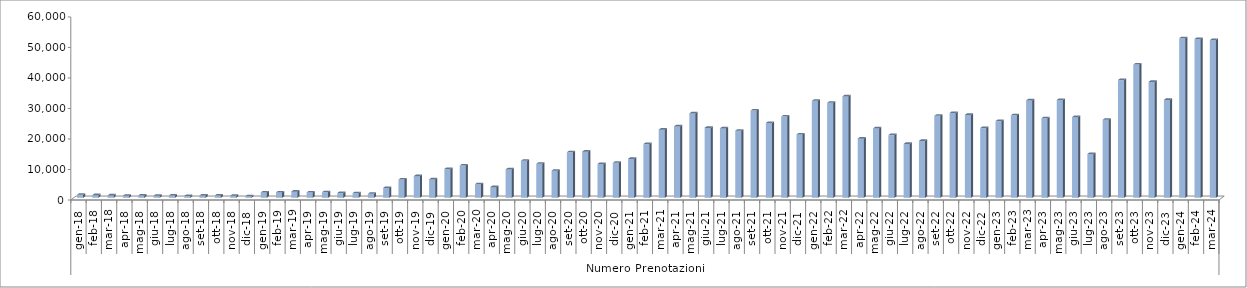
| Category | Series 0 |
|---|---|
| 0 | 996 |
| 1900-01-01 | 849 |
| 1900-01-02 | 765 |
| 1900-01-03 | 668 |
| 1900-01-04 | 737 |
| 1900-01-05 | 673 |
| 1900-01-06 | 732 |
| 1900-01-07 | 570 |
| 1900-01-08 | 752 |
| 1900-01-09 | 752 |
| 1900-01-10 | 648 |
| 1900-01-11 | 466 |
| 1900-01-12 | 1741 |
| 1900-01-13 | 1745 |
| 1900-01-14 | 2021 |
| 1900-01-15 | 1730 |
| 1900-01-16 | 1790 |
| 1900-01-17 | 1559 |
| 1900-01-18 | 1484 |
| 1900-01-19 | 1293 |
| 1900-01-20 | 3217 |
| 1900-01-21 | 5987 |
| 1900-01-22 | 7090 |
| 1900-01-23 | 6030 |
| 1900-01-24 | 9451 |
| 1900-01-25 | 10561 |
| 1900-01-26 | 4442 |
| 1900-01-27 | 3496 |
| 1900-01-28 | 9296 |
| 1900-01-29 | 12120 |
| 1900-01-30 | 11135 |
| 1900-01-31 | 8877 |
| 1900-02-01 | 14903 |
| 1900-02-02 | 15123 |
| 1900-02-03 | 11075 |
| 1900-02-04 | 11456 |
| 1900-02-05 | 12756 |
| 1900-02-06 | 17612 |
| 1900-02-07 | 22323 |
| 1900-02-08 | 23401 |
| 1900-02-09 | 27652 |
| 1900-02-10 | 22918 |
| 1900-02-11 | 22750 |
| 1900-02-12 | 21988 |
| 1900-02-13 | 28587 |
| 1900-02-14 | 24526 |
| 1900-02-15 | 26608 |
| 1900-02-16 | 20755 |
| 1900-02-17 | 31777 |
| 1900-02-18 | 31128 |
| 1900-02-19 | 33234 |
| 1900-02-20 | 19395 |
| 1900-02-21 | 22731 |
| 1900-02-22 | 20543 |
| 1900-02-23 | 17657 |
| 1900-02-24 | 18639 |
| 1900-02-25 | 26870 |
| 1900-02-26 | 27796 |
| 1900-02-27 | 27163 |
| 1900-02-28 | 22847 |
| 1900-02-28 | 25133 |
| 1900-03-01 | 27034 |
| 1900-03-02 | 31908 |
| 1900-03-03 | 26073 |
| 1900-03-04 | 32052 |
| 1900-03-05 | 26434 |
| 1900-03-06 | 14356 |
| 1900-03-07 | 25574 |
| 1900-03-08 | 38589 |
| 1900-03-09 | 43658 |
| 1900-03-10 | 37985 |
| 1900-03-11 | 32076 |
| 1900-03-12 | 52292 |
| 1900-03-13 | 52030 |
| 1900-03-14 | 51663 |